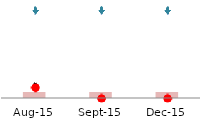
| Category | Series 1 |
|---|---|
| 2015-08-01 | 157 |
| 2015-09-01 | 157 |
| 2015-12-01 | 157 |